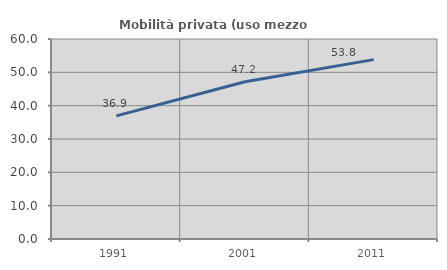
| Category | Mobilità privata (uso mezzo privato) |
|---|---|
| 1991.0 | 36.924 |
| 2001.0 | 47.181 |
| 2011.0 | 53.818 |